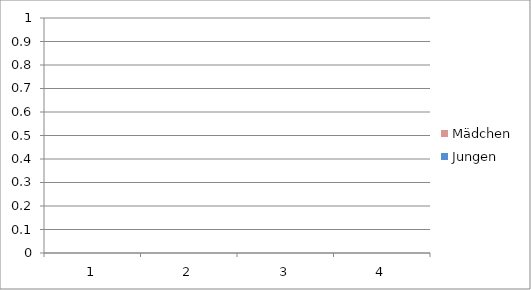
| Category | Jungen | Mädchen |
|---|---|---|
| 0 | 0 | 0 |
| 1 | 0 | 0 |
| 2 | 0 | 0 |
| 3 | 0 | 0 |